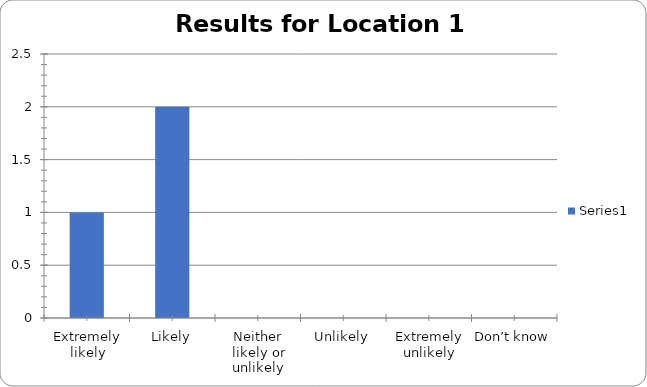
| Category | Series 0 |
|---|---|
| Extremely likely | 1 |
| Likely | 2 |
| Neither likely or unlikely | 0 |
| Unlikely | 0 |
| Extremely unlikely | 0 |
| Don’t know | 0 |